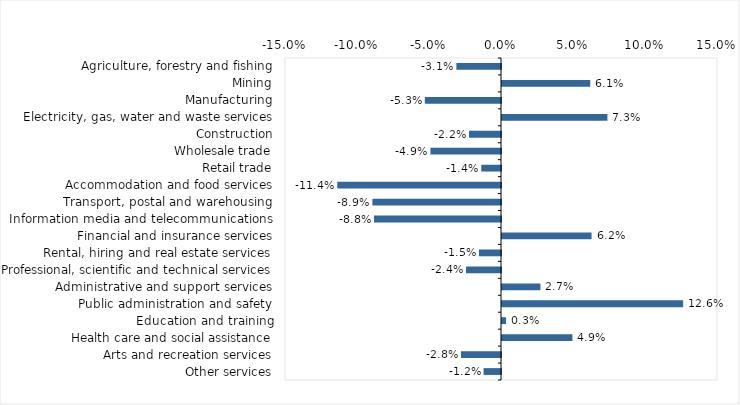
| Category | This week |
|---|---|
| Agriculture, forestry and fishing | -0.031 |
| Mining | 0.061 |
| Manufacturing | -0.053 |
| Electricity, gas, water and waste services | 0.073 |
| Construction | -0.022 |
| Wholesale trade | -0.049 |
| Retail trade | -0.014 |
| Accommodation and food services | -0.114 |
| Transport, postal and warehousing | -0.089 |
| Information media and telecommunications | -0.088 |
| Financial and insurance services | 0.062 |
| Rental, hiring and real estate services | -0.015 |
| Professional, scientific and technical services | -0.024 |
| Administrative and support services | 0.027 |
| Public administration and safety | 0.126 |
| Education and training | 0.003 |
| Health care and social assistance | 0.049 |
| Arts and recreation services | -0.028 |
| Other services | -0.012 |